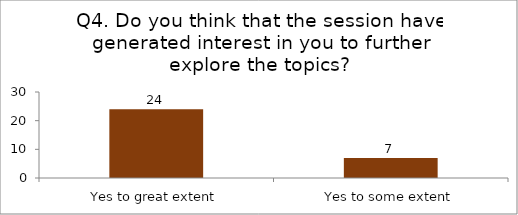
| Category | Q4. Do you think that the session have generated interest in you to further explore the topics? |
|---|---|
| Yes to great extent | 24 |
| Yes to some extent | 7 |